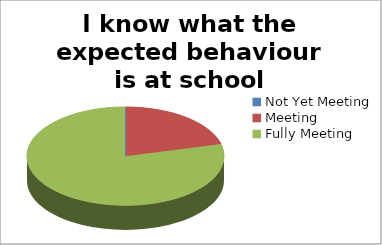
| Category | I know what the expected behaviour is at school |
|---|---|
| Not Yet Meeting | 0 |
| Meeting | 8 |
| Fully Meeting | 30 |